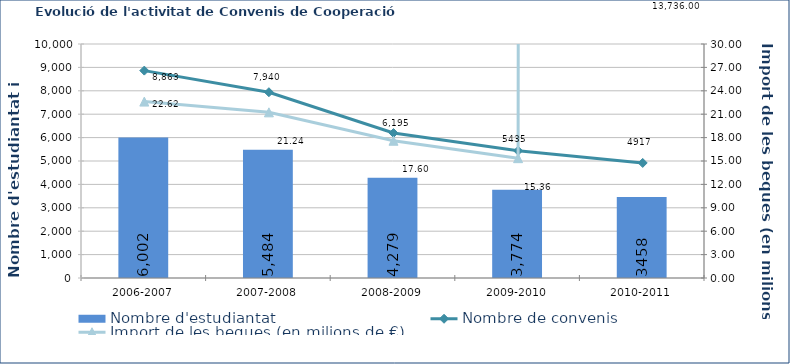
| Category | Nombre d'estudiantat |
|---|---|
| 2006-2007 | 6002 |
| 2007-2008 | 5484 |
| 2008-2009 | 4279 |
| 2009-2010 | 3774 |
| 2010-2011 | 3458 |